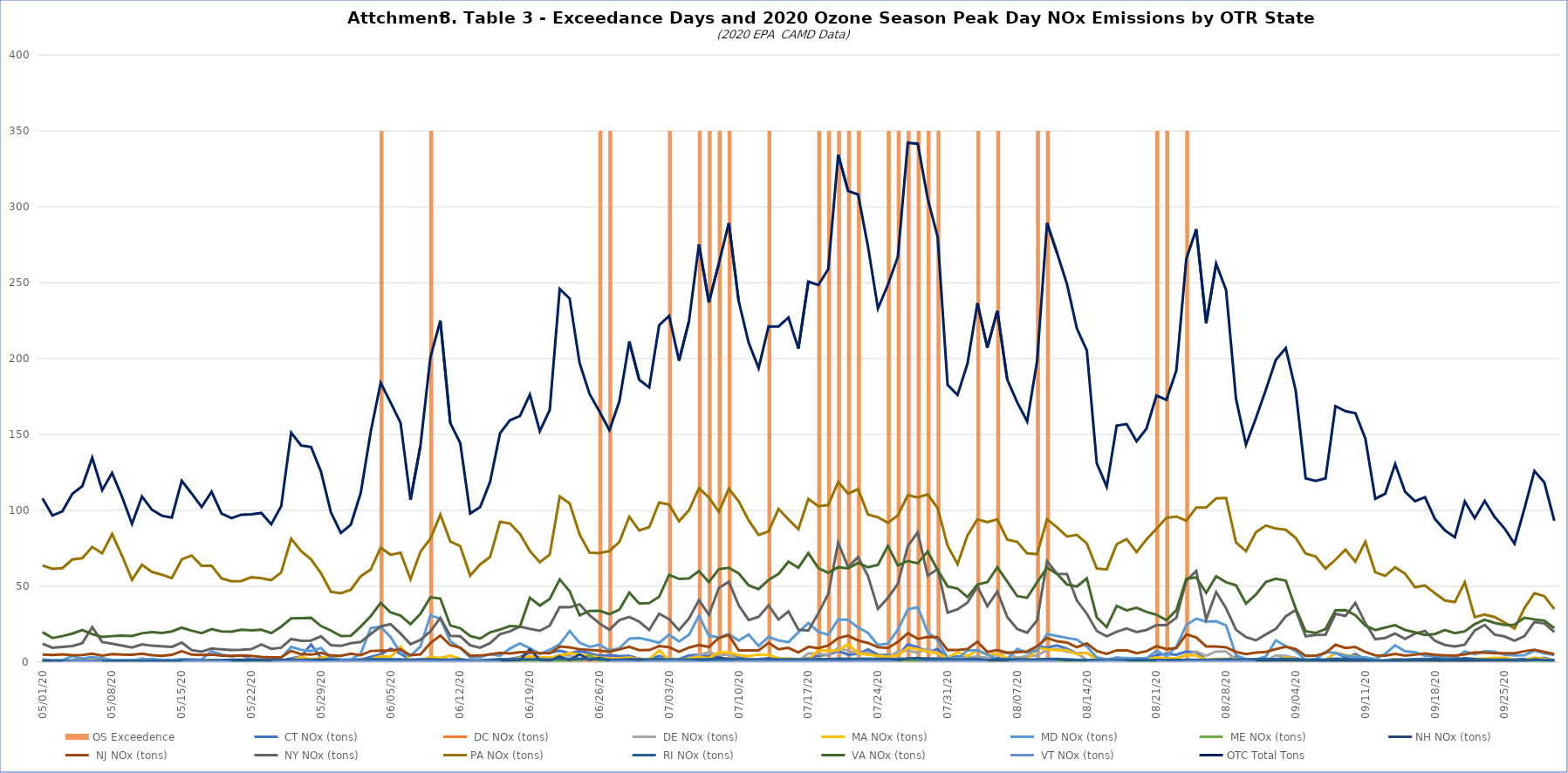
| Category | OS Exceedence |
|---|---|
| 2020-05-01 | 0 |
| 2020-05-02 | 0 |
| 2020-05-03 | 0 |
| 2020-05-04 | 0 |
| 2020-05-05 | 0 |
| 2020-05-06 | 0 |
| 2020-05-07 | 0 |
| 2020-05-08 | 0 |
| 2020-05-09 | 0 |
| 2020-05-10 | 0 |
| 2020-05-11 | 0 |
| 2020-05-12 | 0 |
| 2020-05-13 | 0 |
| 2020-05-14 | 0 |
| 2020-05-15 | 0 |
| 2020-05-16 | 0 |
| 2020-05-17 | 0 |
| 2020-05-18 | 0 |
| 2020-05-19 | 0 |
| 2020-05-20 | 0 |
| 2020-05-21 | 0 |
| 2020-05-22 | 0 |
| 2020-05-23 | 0 |
| 2020-05-24 | 0 |
| 2020-05-25 | 0 |
| 2020-05-26 | 0 |
| 2020-05-27 | 0 |
| 2020-05-28 | 0 |
| 2020-05-29 | 0 |
| 2020-05-30 | 0 |
| 2020-05-31 | 0 |
| 2020-06-01 | 0 |
| 2020-06-02 | 0 |
| 2020-06-03 | 0 |
| 2020-06-04 | 350 |
| 2020-06-05 | 0 |
| 2020-06-06 | 0 |
| 2020-06-07 | 0 |
| 2020-06-08 | 0 |
| 2020-06-09 | 350 |
| 2020-06-10 | 0 |
| 2020-06-11 | 0 |
| 2020-06-12 | 0 |
| 2020-06-13 | 0 |
| 2020-06-14 | 0 |
| 2020-06-15 | 0 |
| 2020-06-16 | 0 |
| 2020-06-17 | 0 |
| 2020-06-18 | 0 |
| 2020-06-19 | 0 |
| 2020-06-20 | 0 |
| 2020-06-21 | 0 |
| 2020-06-22 | 0 |
| 2020-06-23 | 0 |
| 2020-06-24 | 0 |
| 2020-06-25 | 0 |
| 2020-06-26 | 350 |
| 2020-06-27 | 350 |
| 2020-06-28 | 0 |
| 2020-06-29 | 0 |
| 2020-06-30 | 0 |
| 2020-07-01 | 0 |
| 2020-07-02 | 0 |
| 2020-07-03 | 350 |
| 2020-07-04 | 0 |
| 2020-07-05 | 0 |
| 2020-07-06 | 350 |
| 2020-07-07 | 350 |
| 2020-07-08 | 350 |
| 2020-07-09 | 350 |
| 2020-07-10 | 0 |
| 2020-07-11 | 0 |
| 2020-07-12 | 0 |
| 2020-07-13 | 350 |
| 2020-07-14 | 0 |
| 2020-07-15 | 0 |
| 2020-07-16 | 0 |
| 2020-07-17 | 0 |
| 2020-07-18 | 350 |
| 2020-07-19 | 350 |
| 2020-07-20 | 350 |
| 2020-07-21 | 350 |
| 2020-07-22 | 350 |
| 2020-07-23 | 0 |
| 2020-07-24 | 0 |
| 2020-07-25 | 350 |
| 2020-07-26 | 350 |
| 2020-07-27 | 350 |
| 2020-07-28 | 350 |
| 2020-07-29 | 350 |
| 2020-07-30 | 350 |
| 2020-07-31 | 0 |
| 2020-08-01 | 0 |
| 2020-08-02 | 0 |
| 2020-08-03 | 350 |
| 2020-08-04 | 0 |
| 2020-08-05 | 350 |
| 2020-08-06 | 0 |
| 2020-08-07 | 0 |
| 2020-08-08 | 0 |
| 2020-08-09 | 350 |
| 2020-08-10 | 350 |
| 2020-08-11 | 0 |
| 2020-08-12 | 0 |
| 2020-08-13 | 0 |
| 2020-08-14 | 0 |
| 2020-08-15 | 0 |
| 2020-08-16 | 0 |
| 2020-08-17 | 0 |
| 2020-08-18 | 0 |
| 2020-08-19 | 0 |
| 2020-08-20 | 0 |
| 2020-08-21 | 350 |
| 2020-08-22 | 350 |
| 2020-08-23 | 0 |
| 2020-08-24 | 350 |
| 2020-08-25 | 0 |
| 2020-08-26 | 0 |
| 2020-08-27 | 0 |
| 2020-08-28 | 0 |
| 2020-08-29 | 0 |
| 2020-08-30 | 0 |
| 2020-08-31 | 0 |
| 2020-09-01 | 0 |
| 2020-09-02 | 0 |
| 2020-09-03 | 0 |
| 2020-09-04 | 0 |
| 2020-09-05 | 0 |
| 2020-09-06 | 0 |
| 2020-09-07 | 0 |
| 2020-09-08 | 0 |
| 2020-09-09 | 0 |
| 2020-09-10 | 0 |
| 2020-09-11 | 0 |
| 2020-09-12 | 0 |
| 2020-09-13 | 0 |
| 2020-09-14 | 0 |
| 2020-09-15 | 0 |
| 2020-09-16 | 0 |
| 2020-09-17 | 0 |
| 2020-09-18 | 0 |
| 2020-09-19 | 0 |
| 2020-09-20 | 0 |
| 2020-09-21 | 0 |
| 2020-09-22 | 0 |
| 2020-09-23 | 0 |
| 2020-09-24 | 0 |
| 2020-09-25 | 0 |
| 2020-09-26 | 0 |
| 2020-09-27 | 0 |
| 2020-09-28 | 0 |
| 2020-09-29 | 0 |
| 2020-09-30 | 0 |